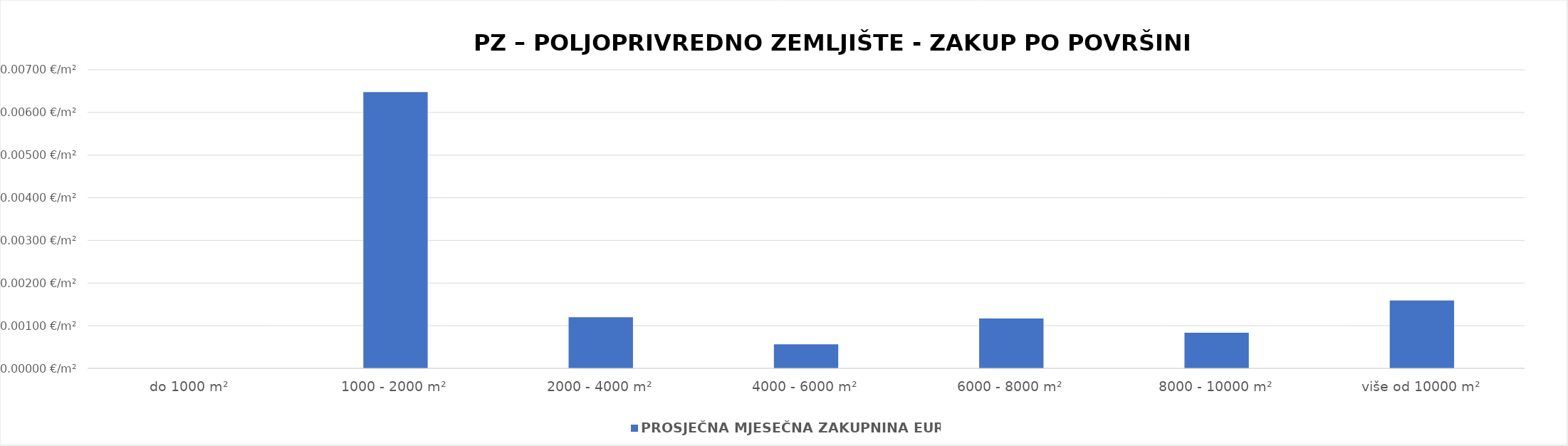
| Category | PROSJEČNA MJESEČNA ZAKUPNINA EUR/m2 |
|---|---|
| do 1000 m² | 0 |
| 1000 - 2000 m² | 0.006 |
| 2000 - 4000 m² | 0.001 |
| 4000 - 6000 m² | 0.001 |
| 6000 - 8000 m² | 0.001 |
| 8000 - 10000 m² | 0.001 |
| više od 10000 m² | 0.002 |